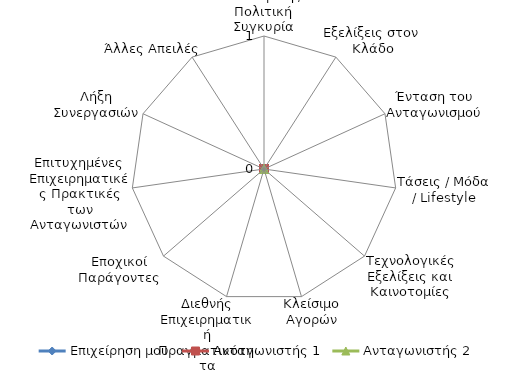
| Category | Επιχείρηση μου | Ανταγωνιστής 1 | Ανταγωνιστής 2 |
|---|---|---|---|
| Οικονομική / Πολιτική Συγκυρία | 1 | 1 | 1 |
| Εξελίξεις στον Κλάδο | 1 | 1 | 2 |
| Ένταση του Ανταγωνισμού | 5 | 5 | 2 |
| Τάσεις / Μόδα / Lifestyle | 4 | 2 | 4 |
| Τεχνολογικές Εξελίξεις και Καινοτομίες | 1 | 4 | 1 |
| Κλείσιμο Αγορών | 1 | 1 | 1 |
| Διεθνής Επιχειρηματική Πραγματικότητα | 5 | 1 | 5 |
| Εποχικοί Παράγοντες | 5 | 5 | 3 |
| Επιτυχημένες Επιχειρηματικές Πρακτικές των Ανταγωνιστών | 7 | 5 | 2 |
| Λήξη Συνεργασιών | 5 | 1 | 4 |
| Άλλες Απειλές | 5 | 1 | 4 |